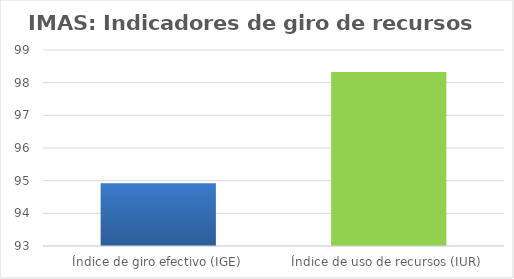
| Category | Series 0 |
|---|---|
| Índice de giro efectivo (IGE) | 94.919 |
| Índice de uso de recursos (IUR)  | 98.329 |